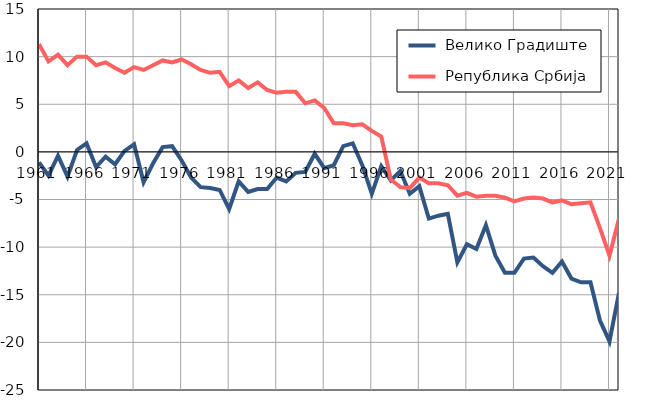
| Category |  Велико Градиште |  Република Србија |
|---|---|---|
| 1961.0 | -1.1 | 11.3 |
| 1962.0 | -2.5 | 9.5 |
| 1963.0 | -0.4 | 10.2 |
| 1964.0 | -2.6 | 9.1 |
| 1965.0 | 0.2 | 10 |
| 1966.0 | 0.9 | 10 |
| 1967.0 | -1.6 | 9.1 |
| 1968.0 | -0.5 | 9.4 |
| 1969.0 | -1.3 | 8.8 |
| 1970.0 | 0.1 | 8.3 |
| 1971.0 | 0.8 | 8.9 |
| 1972.0 | -3.2 | 8.6 |
| 1973.0 | -1.2 | 9.1 |
| 1974.0 | 0.5 | 9.6 |
| 1975.0 | 0.6 | 9.4 |
| 1976.0 | -0.9 | 9.7 |
| 1977.0 | -2.7 | 9.2 |
| 1978.0 | -3.7 | 8.6 |
| 1979.0 | -3.8 | 8.3 |
| 1980.0 | -4 | 8.4 |
| 1981.0 | -6 | 6.9 |
| 1982.0 | -3.1 | 7.5 |
| 1983.0 | -4.2 | 6.7 |
| 1984.0 | -3.9 | 7.3 |
| 1985.0 | -3.9 | 6.5 |
| 1986.0 | -2.7 | 6.2 |
| 1987.0 | -3.1 | 6.3 |
| 1988.0 | -2.2 | 6.3 |
| 1989.0 | -2.1 | 5.1 |
| 1990.0 | -0.2 | 5.4 |
| 1991.0 | -1.7 | 4.6 |
| 1992.0 | -1.4 | 3 |
| 1993.0 | 0.6 | 3 |
| 1994.0 | 0.9 | 2.8 |
| 1995.0 | -1.4 | 2.9 |
| 1996.0 | -4.4 | 2.2 |
| 1997.0 | -1.5 | 1.6 |
| 1998.0 | -3 | -2.9 |
| 1999.0 | -2 | -3.7 |
| 2000.0 | -4.4 | -3.8 |
| 2001.0 | -3.6 | -2.7 |
| 2002.0 | -7 | -3.3 |
| 2003.0 | -6.7 | -3.3 |
| 2004.0 | -6.5 | -3.5 |
| 2005.0 | -11.6 | -4.6 |
| 2006.0 | -9.7 | -4.3 |
| 2007.0 | -10.2 | -4.7 |
| 2008.0 | -7.7 | -4.6 |
| 2009.0 | -10.9 | -4.6 |
| 2010.0 | -12.7 | -4.8 |
| 2011.0 | -12.7 | -5.2 |
| 2012.0 | -11.2 | -4.9 |
| 2013.0 | -11.1 | -4.8 |
| 2014.0 | -12 | -4.9 |
| 2015.0 | -12.7 | -5.3 |
| 2016.0 | -11.5 | -5.1 |
| 2017.0 | -13.3 | -5.5 |
| 2018.0 | -13.7 | -5.4 |
| 2019.0 | -13.7 | -5.3 |
| 2020.0 | -17.7 | -8 |
| 2021.0 | -19.9 | -10.9 |
| 2022.0 | -14.8 | -7 |